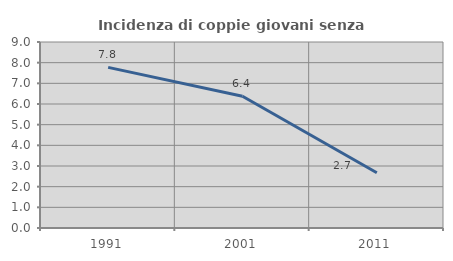
| Category | Incidenza di coppie giovani senza figli |
|---|---|
| 1991.0 | 7.773 |
| 2001.0 | 6.373 |
| 2011.0 | 2.676 |